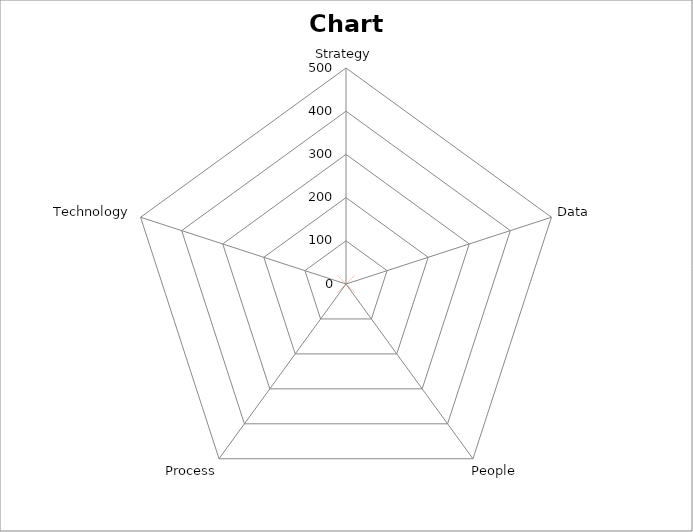
| Category | Column2 | Total Score |
|---|---|---|
| Strategy |  | 0 |
| Data |  | 0 |
| People |  | 0 |
| Process |  | 0 |
| Technology |  | 0 |